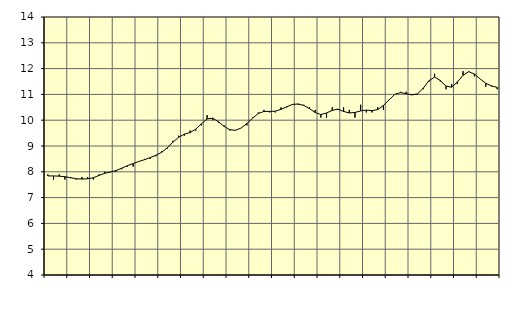
| Category | Piggar | Byggverksamhet, SNI 41-43 |
|---|---|---|
| nan | 7.9 | 7.84 |
| 1.0 | 7.7 | 7.84 |
| 1.0 | 7.9 | 7.83 |
| 1.0 | 7.7 | 7.81 |
| nan | 7.8 | 7.77 |
| 2.0 | 7.7 | 7.73 |
| 2.0 | 7.8 | 7.72 |
| 2.0 | 7.8 | 7.73 |
| nan | 7.7 | 7.77 |
| 3.0 | 7.9 | 7.86 |
| 3.0 | 8 | 7.94 |
| 3.0 | 8 | 7.99 |
| nan | 8 | 8.05 |
| 4.0 | 8.1 | 8.14 |
| 4.0 | 8.2 | 8.24 |
| 4.0 | 8.2 | 8.32 |
| nan | 8.4 | 8.4 |
| 5.0 | 8.5 | 8.47 |
| 5.0 | 8.5 | 8.55 |
| 5.0 | 8.6 | 8.64 |
| nan | 8.8 | 8.75 |
| 6.0 | 8.9 | 8.93 |
| 6.0 | 9.2 | 9.15 |
| 6.0 | 9.4 | 9.34 |
| nan | 9.4 | 9.46 |
| 7.0 | 9.6 | 9.52 |
| 7.0 | 9.6 | 9.65 |
| 7.0 | 9.8 | 9.86 |
| nan | 10.2 | 10.05 |
| 8.0 | 10 | 10.08 |
| 8.0 | 9.9 | 9.94 |
| 8.0 | 9.8 | 9.76 |
| nan | 9.6 | 9.63 |
| 9.0 | 9.6 | 9.61 |
| 9.0 | 9.7 | 9.7 |
| 9.0 | 9.8 | 9.87 |
| nan | 10.1 | 10.08 |
| 10.0 | 10.3 | 10.26 |
| 10.0 | 10.4 | 10.34 |
| 10.0 | 10.3 | 10.34 |
| nan | 10.3 | 10.35 |
| 11.0 | 10.5 | 10.42 |
| 11.0 | 10.5 | 10.52 |
| 11.0 | 10.6 | 10.61 |
| nan | 10.6 | 10.63 |
| 12.0 | 10.6 | 10.57 |
| 12.0 | 10.5 | 10.45 |
| 12.0 | 10.4 | 10.3 |
| nan | 10.1 | 10.22 |
| 13.0 | 10.1 | 10.28 |
| 13.0 | 10.5 | 10.38 |
| 13.0 | 10.4 | 10.43 |
| nan | 10.5 | 10.34 |
| 14.0 | 10.4 | 10.28 |
| 14.0 | 10.1 | 10.3 |
| 14.0 | 10.6 | 10.36 |
| nan | 10.3 | 10.39 |
| 15.0 | 10.3 | 10.37 |
| 15.0 | 10.5 | 10.41 |
| 15.0 | 10.4 | 10.57 |
| nan | 10.8 | 10.79 |
| 16.0 | 11 | 11 |
| 16.0 | 11.1 | 11.07 |
| 16.0 | 11.1 | 11.03 |
| nan | 11 | 10.98 |
| 17.0 | 11 | 11.02 |
| 17.0 | 11.2 | 11.24 |
| 17.0 | 11.5 | 11.53 |
| nan | 11.8 | 11.67 |
| 18.0 | 11.5 | 11.54 |
| 18.0 | 11.2 | 11.32 |
| 18.0 | 11.4 | 11.28 |
| nan | 11.4 | 11.48 |
| 19.0 | 11.9 | 11.74 |
| 19.0 | 11.9 | 11.88 |
| 19.0 | 11.7 | 11.79 |
| nan | 11.6 | 11.6 |
| 20.0 | 11.3 | 11.43 |
| 20.0 | 11.3 | 11.33 |
| 20.0 | 11.2 | 11.27 |